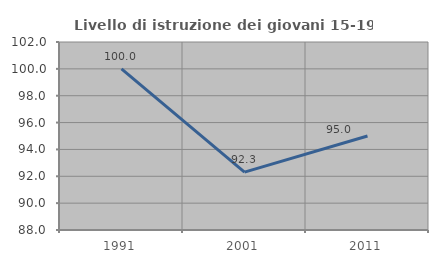
| Category | Livello di istruzione dei giovani 15-19 anni |
|---|---|
| 1991.0 | 100 |
| 2001.0 | 92.308 |
| 2011.0 | 95 |